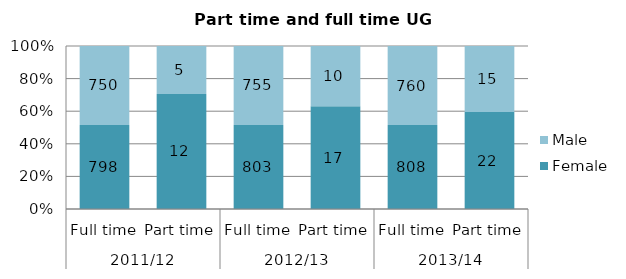
| Category | Female | Male |
|---|---|---|
| 0 | 798 | 750 |
| 1 | 12 | 5 |
| 2 | 803 | 755 |
| 3 | 17 | 10 |
| 4 | 808 | 760 |
| 5 | 22 | 15 |